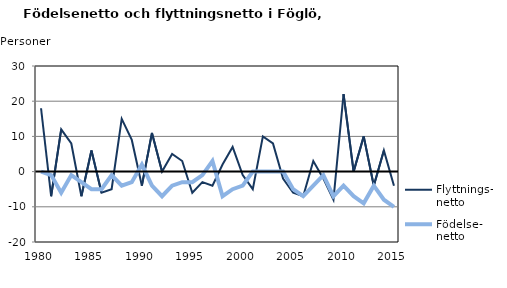
| Category | Flyttnings- netto | Födelse- netto |
|---|---|---|
| 1980.0 | 18 | 0 |
| 1981.0 | -7 | -1 |
| 1982.0 | 12 | -6 |
| 1983.0 | 8 | -1 |
| 1984.0 | -7 | -3 |
| 1985.0 | 6 | -5 |
| 1986.0 | -6 | -5 |
| 1987.0 | -5 | -1 |
| 1988.0 | 15 | -4 |
| 1989.0 | 9 | -3 |
| 1990.0 | -4 | 2 |
| 1991.0 | 11 | -4 |
| 1992.0 | 0 | -7 |
| 1993.0 | 5 | -4 |
| 1994.0 | 3 | -3 |
| 1995.0 | -6 | -3 |
| 1996.0 | -3 | -1 |
| 1997.0 | -4 | 3 |
| 1998.0 | 2 | -7 |
| 1999.0 | 7 | -5 |
| 2000.0 | -1 | -4 |
| 2001.0 | -5 | 0 |
| 2002.0 | 10 | 0 |
| 2003.0 | 8 | 0 |
| 2004.0 | -2 | 0 |
| 2005.0 | -6 | -5 |
| 2006.0 | -7 | -7 |
| 2007.0 | 3 | -4 |
| 2008.0 | -2 | -1 |
| 2009.0 | -8 | -7 |
| 2010.0 | 22 | -4 |
| 2011.0 | 0 | -7 |
| 2012.0 | 10 | -9 |
| 2013.0 | -4 | -4 |
| 2014.0 | 6 | -8 |
| 2015.0 | -4 | -10 |